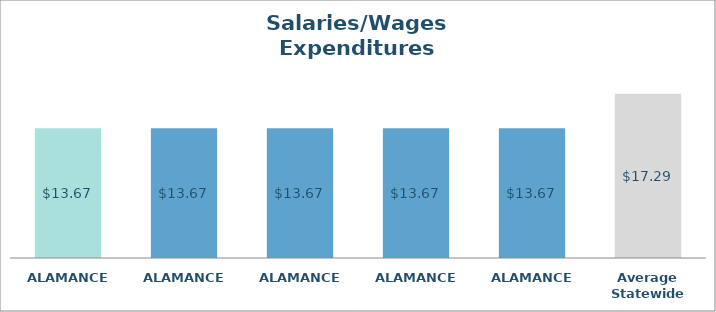
| Category | Series 0 |
|---|---|
| ALAMANCE  | 13.669 |
| ALAMANCE  | 13.669 |
| ALAMANCE  | 13.669 |
| ALAMANCE  | 13.669 |
| ALAMANCE  | 13.669 |
| Average Statewide | 17.285 |